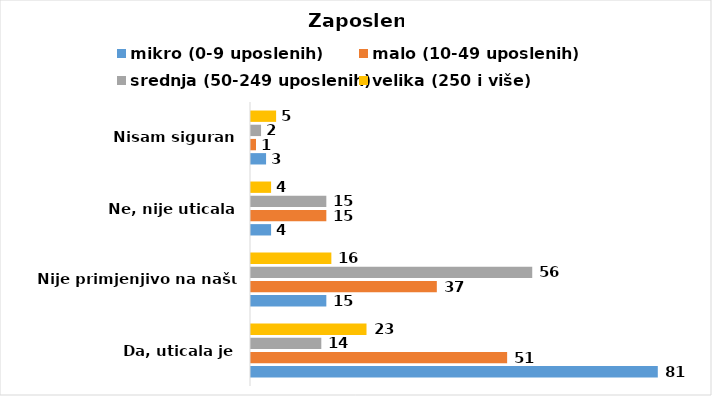
| Category | mikro (0-9 uposlenih) | malo (10-49 uposlenih) | srednja (50-249 uposlenih) | velika (250 i više) |
|---|---|---|---|---|
| Da, uticala je | 81 | 51 | 14 | 23 |
| Nije primjenjivo na našu firmu | 15 | 37 | 56 | 16 |
| Ne, nije uticala | 4 | 15 | 15 | 4 |
| Nisam siguran | 3 | 1 | 2 | 5 |